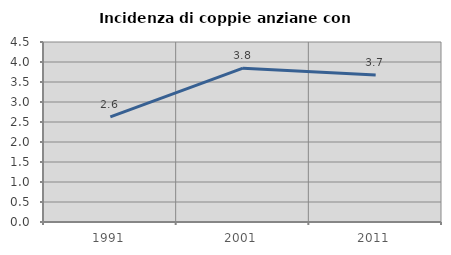
| Category | Incidenza di coppie anziane con figli |
|---|---|
| 1991.0 | 2.626 |
| 2001.0 | 3.846 |
| 2011.0 | 3.673 |